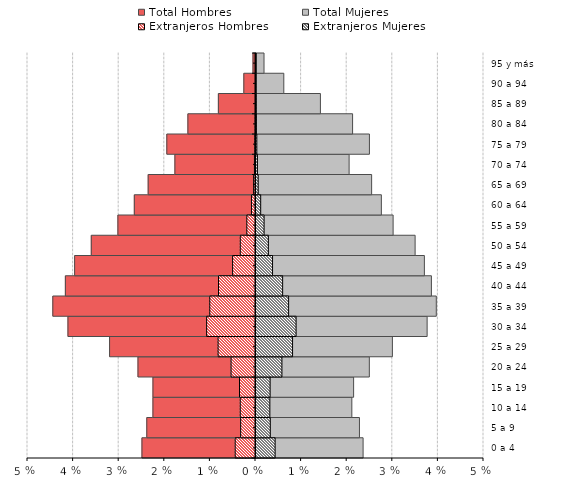
| Category | Total Hombres | Total Mujeres | Extranjeros Hombres | Extranjeros Mujeres |
|---|---|---|---|---|
| 0 a 4 | -0.025 | 0.023 | -0.004 | 0.004 |
| 5 a 9 | -0.024 | 0.023 | -0.003 | 0.003 |
| 10 a 14 | -0.022 | 0.021 | -0.003 | 0.003 |
| 15 a 19 | -0.022 | 0.021 | -0.004 | 0.003 |
| 20 a 24 | -0.026 | 0.025 | -0.005 | 0.006 |
| 25 a 29 | -0.032 | 0.03 | -0.008 | 0.008 |
| 30 a 34 | -0.041 | 0.038 | -0.011 | 0.009 |
| 35 a 39 | -0.044 | 0.04 | -0.01 | 0.007 |
| 40 a 44 | -0.042 | 0.038 | -0.008 | 0.006 |
| 45 a 49 | -0.04 | 0.037 | -0.005 | 0.004 |
| 50 a 54 | -0.036 | 0.035 | -0.003 | 0.003 |
| 55 a 59 | -0.03 | 0.03 | -0.002 | 0.002 |
| 60 a 64 | -0.027 | 0.027 | -0.001 | 0.001 |
| 65 a 69 | -0.024 | 0.025 | 0 | 0 |
| 70 a 74 | -0.018 | 0.02 | 0 | 0 |
| 75 a 79 | -0.019 | 0.025 | 0 | 0 |
| 80 a 84 | -0.015 | 0.021 | 0 | 0 |
| 85 a 89 | -0.008 | 0.014 | 0 | 0 |
| 90 a 94 | -0.003 | 0.006 | 0 | 0 |
| 95 y más | -0.001 | 0.002 | 0 | 0 |